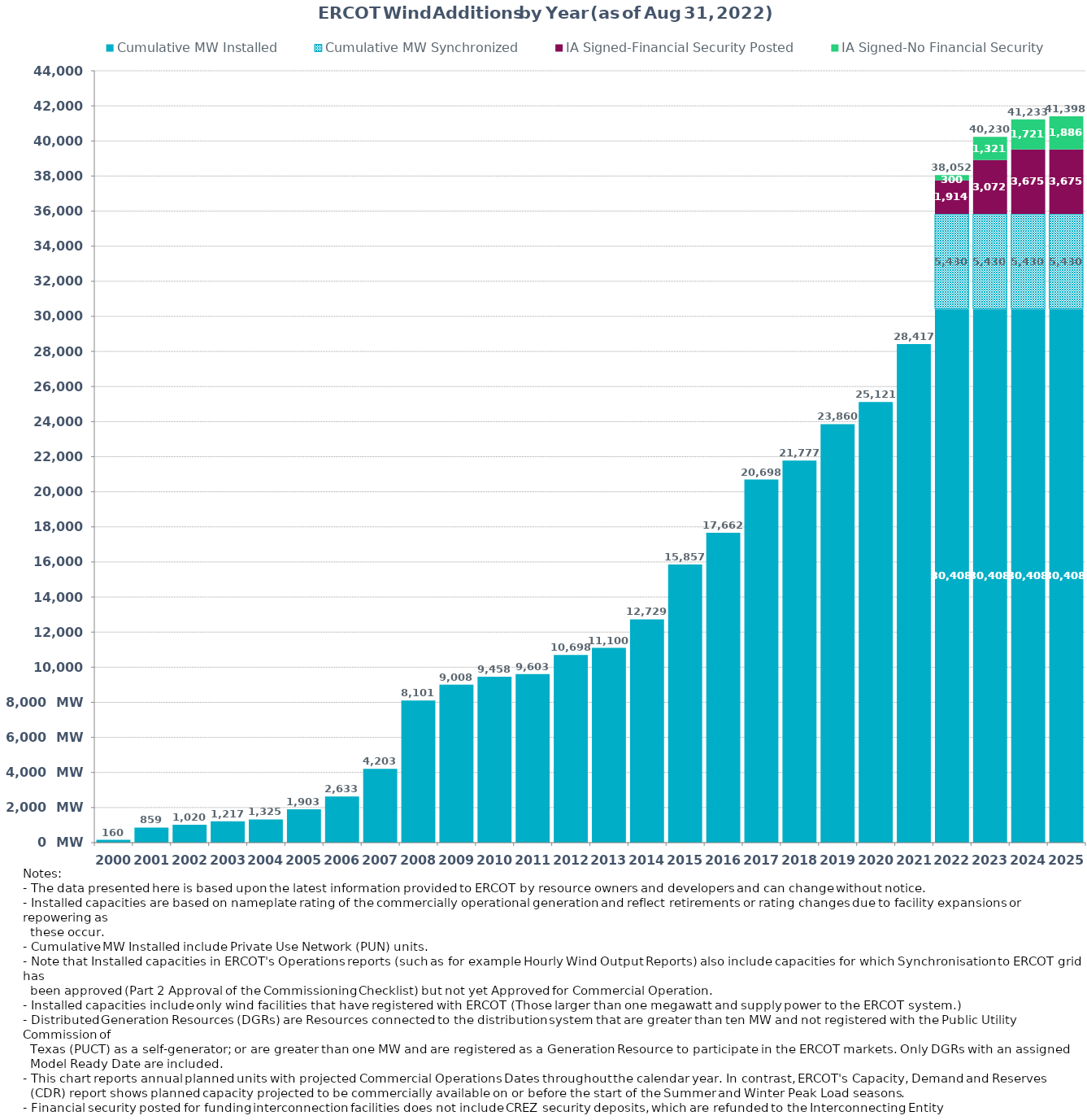
| Category | Cumulative MW Installed | Cumulative MW Synchronized | IA Signed-Financial Security Posted  | IA Signed-No Financial Security  | Other Planned | Cumulative Installed and Planned |
|---|---|---|---|---|---|---|
| 2000.0 | 160.37 | 0 | 0 | 0 | 0 | 160.37 |
| 2001.0 | 859.29 | 0 | 0 | 0 | 0 | 859.29 |
| 2002.0 | 1019.79 | 0 | 0 | 0 | 0 | 1019.79 |
| 2003.0 | 1217.29 | 0 | 0 | 0 | 0 | 1217.29 |
| 2004.0 | 1325.29 | 0 | 0 | 0 | 0 | 1325.29 |
| 2005.0 | 1902.69 | 0 | 0 | 0 | 0 | 1902.69 |
| 2006.0 | 2633.39 | 0 | 0 | 0 | 0 | 2633.39 |
| 2007.0 | 4203.41 | 0 | 0 | 0 | 0 | 4203.41 |
| 2008.0 | 8101.01 | 0 | 0 | 0 | 0 | 8101.01 |
| 2009.0 | 9007.57 | 0 | 0 | 0 | 0 | 9007.57 |
| 2010.0 | 9458.49 | 0 | 0 | 0 | 0 | 9458.49 |
| 2011.0 | 9603.49 | 0 | 0 | 0 | 0 | 9603.49 |
| 2012.0 | 10698.35 | 0 | 0 | 0 | 0 | 10698.35 |
| 2013.0 | 11100.05 | 0 | 0 | 0 | 0 | 11100.05 |
| 2014.0 | 12728.93 | 0 | 0 | 0 | 0 | 12728.93 |
| 2015.0 | 15857.48 | 0 | 0 | 0 | 0 | 15857.48 |
| 2016.0 | 17662.45 | 0 | 0 | 0 | 0 | 17662.45 |
| 2017.0 | 20697.84 | 0 | 0 | 0 | 0 | 20697.84 |
| 2018.0 | 21777 | 0 | 0 | 0 | 0 | 21777 |
| 2019.0 | 23860 | 0 | 0 | 0 | 0 | 23860 |
| 2020.0 | 25121 | 0 | 0 | 0 | 0 | 25121 |
| 2021.0 | 28416.82 | 0 | 0 | 0 | 0 | 28416.82 |
| 2022.0 | 30407.68 | 5430.04 | 1914.44 | 299.5 | 0 | 38051.66 |
| 2023.0 | 30407.68 | 5430.04 | 3071.96 | 1320.7 | 0 | 40230.38 |
| 2024.0 | 30407.68 | 5430.04 | 3675.02 | 1720.7 | 0 | 41233.44 |
| 2025.0 | 30407.68 | 5430.04 | 3675.02 | 1885.7 | 0 | 41398.44 |